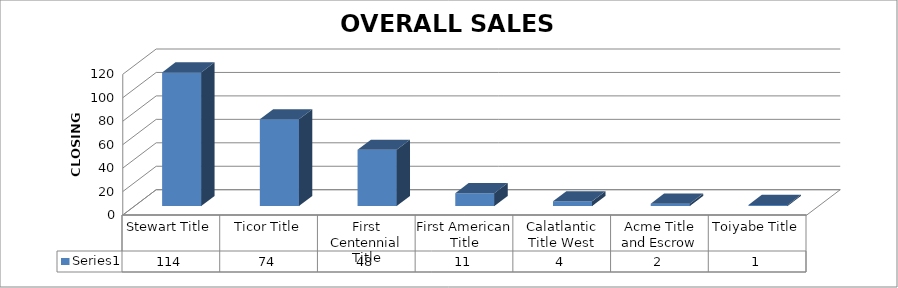
| Category | Series 0 |
|---|---|
| Stewart Title | 114 |
| Ticor Title | 74 |
| First Centennial Title | 48 |
| First American Title | 11 |
| Calatlantic Title West | 4 |
| Acme Title and Escrow | 2 |
| Toiyabe Title | 1 |